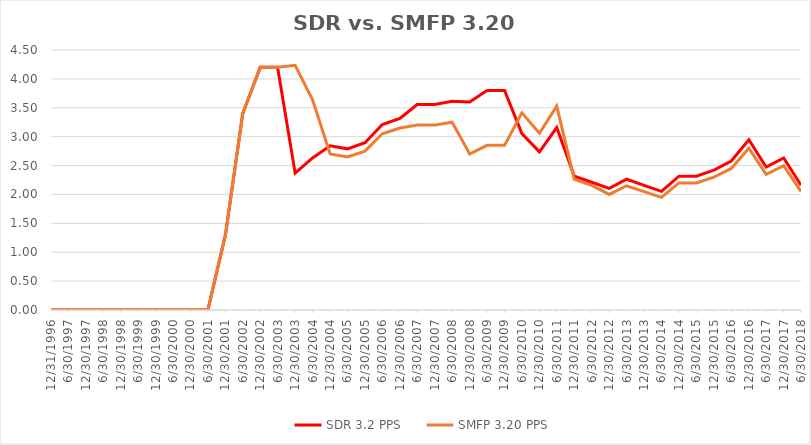
| Category | SDR 3.2 PPS | SMFP 3.20 PPS |
|---|---|---|
| 12/31/96 | 0 | 0 |
| 6/30/97 | 0 | 0 |
| 12/31/97 | 0 | 0 |
| 6/30/98 | 0 | 0 |
| 12/31/98 | 0 | 0 |
| 6/30/99 | 0 | 0 |
| 12/31/99 | 0 | 0 |
| 6/30/00 | 0 | 0 |
| 12/31/00 | 0 | 0 |
| 6/30/01 | 0 | 0 |
| 12/31/01 | 1.3 | 1.3 |
| 6/30/02 | 3.4 | 3.4 |
| 12/31/02 | 4.2 | 4.2 |
| 6/30/03 | 4.2 | 4.2 |
| 12/31/03 | 2.368 | 4.235 |
| 6/30/04 | 2.632 | 3.636 |
| 12/31/04 | 2.842 | 2.7 |
| 6/30/05 | 2.789 | 2.65 |
| 12/31/05 | 2.895 | 2.75 |
| 6/30/06 | 3.211 | 3.05 |
| 12/31/06 | 3.316 | 3.15 |
| 6/30/07 | 3.556 | 3.2 |
| 12/31/07 | 3.556 | 3.2 |
| 6/30/08 | 3.611 | 3.25 |
| 12/31/08 | 3.6 | 2.7 |
| 6/30/09 | 3.8 | 2.85 |
| 12/31/09 | 3.8 | 2.85 |
| 6/30/10 | 3.053 | 3.412 |
| 12/31/10 | 2.737 | 3.059 |
| 6/30/11 | 3.158 | 3.529 |
| 12/31/11 | 2.316 | 2.26 |
| 6/30/12 | 2.211 | 2.157 |
| 12/31/12 | 2.105 | 2 |
| 6/30/13 | 2.263 | 2.15 |
| 12/31/13 | 2.158 | 2.05 |
| 6/30/14 | 2.053 | 1.95 |
| 12/31/14 | 2.316 | 2.2 |
| 6/30/15 | 2.316 | 2.2 |
| 12/31/15 | 2.421 | 2.3 |
| 6/30/16 | 2.579 | 2.45 |
| 12/31/16 | 2.947 | 2.8 |
| 6/30/17 | 2.474 | 2.35 |
| 12/31/17 | 2.632 | 2.5 |
| 6/30/18 | 2.158 | 2.05 |